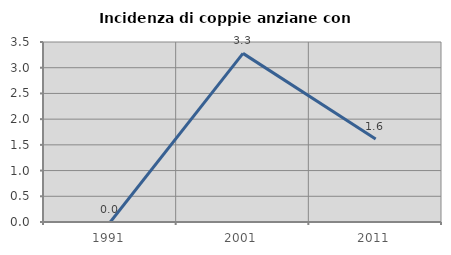
| Category | Incidenza di coppie anziane con figli |
|---|---|
| 1991.0 | 0 |
| 2001.0 | 3.279 |
| 2011.0 | 1.613 |